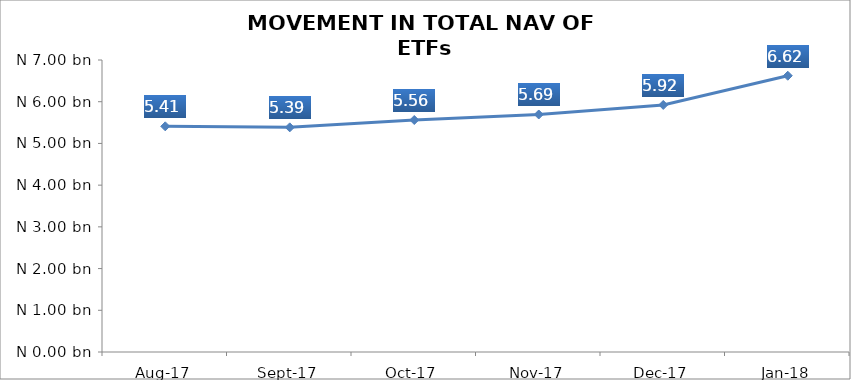
| Category | Series 0 |
|---|---|
| 2017-08-01 | 5410071931.29 |
| 2017-09-01 | 5385378575.54 |
| 2017-10-01 | 5561634501.26 |
| 2017-11-01 | 5693600846.84 |
| 2017-12-01 | 5922585158.84 |
| 2018-01-01 | 6622511401.11 |